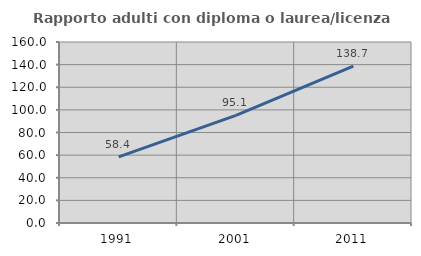
| Category | Rapporto adulti con diploma o laurea/licenza media  |
|---|---|
| 1991.0 | 58.416 |
| 2001.0 | 95.067 |
| 2011.0 | 138.651 |